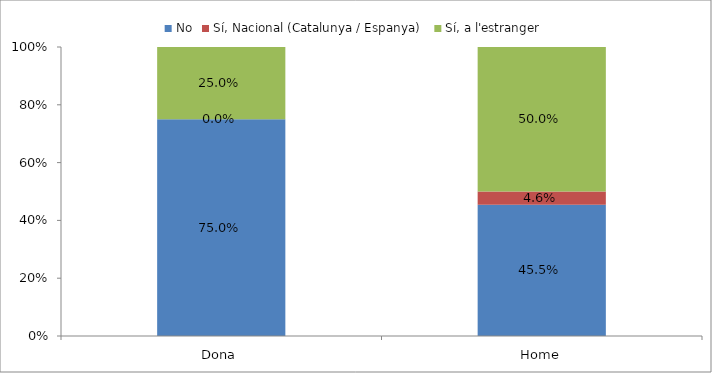
| Category | No | Sí, Nacional (Catalunya / Espanya) | Sí, a l'estranger |
|---|---|---|---|
| Dona | 0.75 | 0 | 0.25 |
| Home | 0.454 | 0.046 | 0.5 |